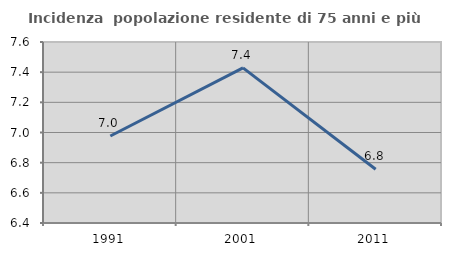
| Category | Incidenza  popolazione residente di 75 anni e più |
|---|---|
| 1991.0 | 6.977 |
| 2001.0 | 7.429 |
| 2011.0 | 6.757 |